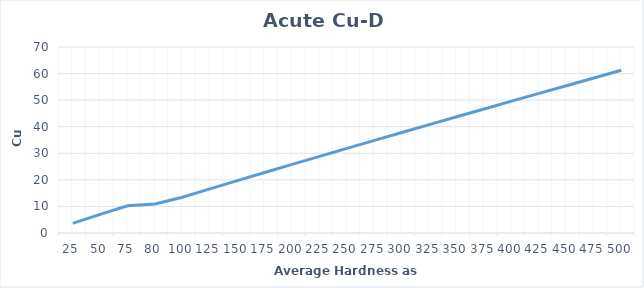
| Category | Acute Cu-D Standard |
|---|---|
| 25.0 | 3.64 |
| 50.0 | 6.994 |
| 75.0 | 10.249 |
| 80.0 | 10.891 |
| 100.0 | 13.439 |
| 125.0 | 16.584 |
| 150.0 | 19.692 |
| 175.0 | 22.77 |
| 200.0 | 25.823 |
| 225.0 | 28.854 |
| 250.0 | 31.865 |
| 275.0 | 34.859 |
| 300.0 | 37.838 |
| 325.0 | 40.802 |
| 350.0 | 43.752 |
| 375.0 | 46.691 |
| 400.0 | 49.618 |
| 425.0 | 52.535 |
| 450.0 | 55.442 |
| 475.0 | 58.339 |
| 500.0 | 61.228 |